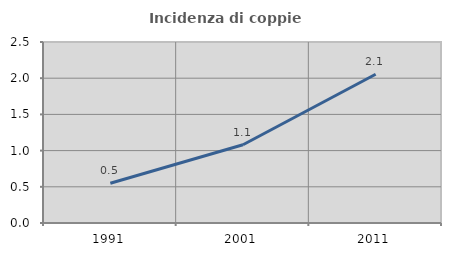
| Category | Incidenza di coppie miste |
|---|---|
| 1991.0 | 0.548 |
| 2001.0 | 1.081 |
| 2011.0 | 2.054 |